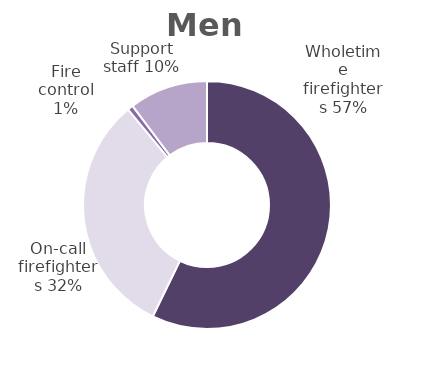
| Category | Men |
|---|---|
| Wholetime firefighters | 0.572 |
| On-call firefighters | 0.318 |
| Fire control | 0.007 |
| Support staff | 0.103 |